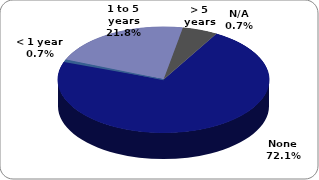
| Category | Series 0 |
|---|---|
| None | 0.721 |
| < 1 year | 0.007 |
| 1 to 5 years | 0.218 |
| > 5 years | 0.054 |